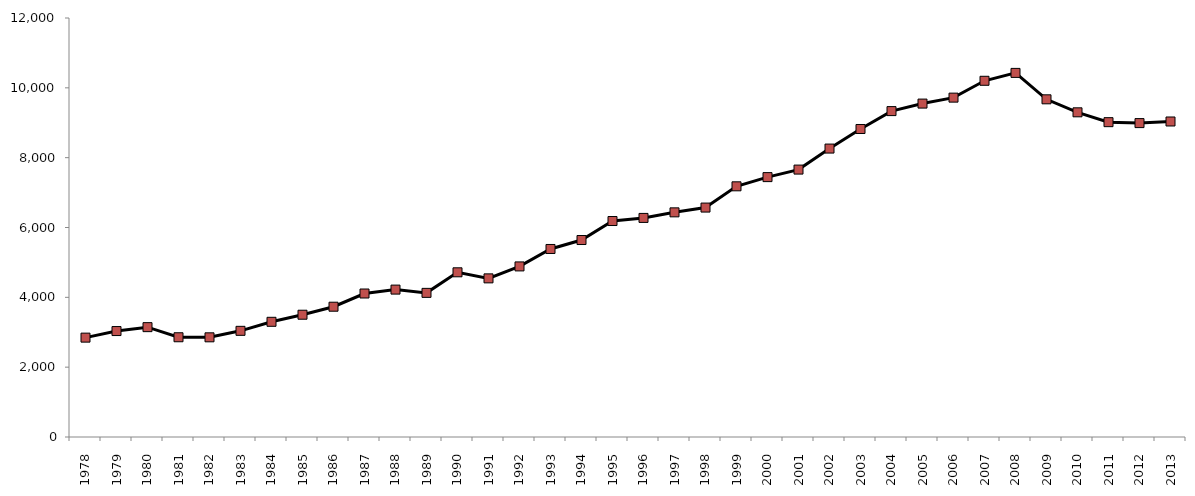
| Category | Total Passenger Throughput NI Ports  |
|---|---|
| 1978.0 | 2845979 |
| 1979.0 | 3034256 |
| 1980.0 | 3145887 |
| 1981.0 | 2856726 |
| 1982.0 | 2854655 |
| 1983.0 | 3040635 |
| 1984.0 | 3299348 |
| 1985.0 | 3501738 |
| 1986.0 | 3731483 |
| 1987.0 | 4109737 |
| 1988.0 | 4221566 |
| 1989.0 | 4127783 |
| 1990.0 | 4716631 |
| 1991.0 | 4543180 |
| 1992.0 | 4885583 |
| 1993.0 | 5384889 |
| 1994.0 | 5641552 |
| 1995.0 | 6185465 |
| 1996.0 | 6274612 |
| 1997.0 | 6434010 |
| 1998.0 | 6570741 |
| 1999.0 | 7179242 |
| 2000.0 | 7443034 |
| 2001.0 | 7658417 |
| 2002.0 | 8260616 |
| 2003.0 | 8821023 |
| 2004.0 | 9333610 |
| 2005.0 | 9548866 |
| 2006.0 | 9719414 |
| 2007.0 | 10201536 |
| 2008.0 | 10427600 |
| 2009.0 | 9671107 |
| 2010.0 | 9298804 |
| 2011.0 | 9016772 |
| 2012.0 | 8989874 |
| 2013.0 | 9036164 |